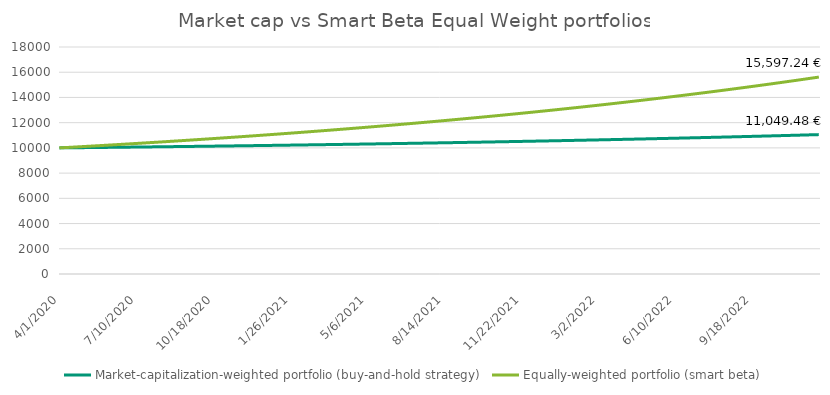
| Category | Equally-weighted portfolio (smart beta) | Market-capitalization-weighted portfolio (buy-and-hold strategy) |
|---|---|---|
| 4/1/20 |  | 10000 |
| 4/2/20 |  | 10000.625 |
| 4/3/20 |  | 10001.251 |
| 4/4/20 |  | 10001.877 |
| 4/5/20 |  | 10002.504 |
| 4/6/20 |  | 10003.131 |
| 4/7/20 |  | 10003.759 |
| 4/8/20 |  | 10004.388 |
| 4/9/20 |  | 10005.018 |
| 4/10/20 |  | 10005.648 |
| 4/11/20 |  | 10006.278 |
| 4/12/20 |  | 10006.909 |
| 4/13/20 |  | 10007.541 |
| 4/14/20 |  | 10008.174 |
| 4/15/20 |  | 10008.807 |
| 4/16/20 |  | 10009.441 |
| 4/17/20 |  | 10010.075 |
| 4/18/20 |  | 10010.71 |
| 4/19/20 |  | 10011.346 |
| 4/20/20 |  | 10011.982 |
| 4/21/20 |  | 10012.619 |
| 4/22/20 |  | 10013.257 |
| 4/23/20 |  | 10013.895 |
| 4/24/20 |  | 10014.534 |
| 4/25/20 |  | 10015.174 |
| 4/26/20 |  | 10015.814 |
| 4/27/20 |  | 10016.455 |
| 4/28/20 |  | 10017.096 |
| 4/29/20 |  | 10017.738 |
| 4/30/20 |  | 10018.381 |
| 5/1/20 |  | 10019.024 |
| 5/2/20 |  | 10019.668 |
| 5/3/20 |  | 10020.313 |
| 5/4/20 |  | 10020.958 |
| 5/5/20 |  | 10021.604 |
| 5/6/20 |  | 10022.251 |
| 5/7/20 |  | 10022.898 |
| 5/8/20 |  | 10023.546 |
| 5/9/20 |  | 10024.195 |
| 5/10/20 |  | 10024.844 |
| 5/11/20 |  | 10025.494 |
| 5/12/20 |  | 10026.144 |
| 5/13/20 |  | 10026.795 |
| 5/14/20 |  | 10027.447 |
| 5/15/20 |  | 10028.1 |
| 5/16/20 |  | 10028.753 |
| 5/17/20 |  | 10029.406 |
| 5/18/20 |  | 10030.061 |
| 5/19/20 |  | 10030.716 |
| 5/20/20 |  | 10031.372 |
| 5/21/20 |  | 10032.028 |
| 5/22/20 |  | 10032.685 |
| 5/23/20 |  | 10033.343 |
| 5/24/20 |  | 10034.001 |
| 5/25/20 |  | 10034.66 |
| 5/26/20 |  | 10035.32 |
| 5/27/20 |  | 10035.98 |
| 5/28/20 |  | 10036.641 |
| 5/29/20 |  | 10037.303 |
| 5/30/20 |  | 10037.965 |
| 5/31/20 |  | 10038.628 |
| 6/1/20 |  | 10039.292 |
| 6/2/20 |  | 10039.956 |
| 6/3/20 |  | 10040.621 |
| 6/4/20 |  | 10041.286 |
| 6/5/20 |  | 10041.953 |
| 6/6/20 |  | 10042.62 |
| 6/7/20 |  | 10043.287 |
| 6/8/20 |  | 10043.956 |
| 6/9/20 |  | 10044.625 |
| 6/10/20 |  | 10045.294 |
| 6/11/20 |  | 10045.964 |
| 6/12/20 |  | 10046.635 |
| 6/13/20 |  | 10047.307 |
| 6/14/20 |  | 10047.979 |
| 6/15/20 |  | 10048.652 |
| 6/16/20 |  | 10049.326 |
| 6/17/20 |  | 10050 |
| 6/18/20 |  | 10050.675 |
| 6/19/20 |  | 10051.351 |
| 6/20/20 |  | 10052.027 |
| 6/21/20 |  | 10052.704 |
| 6/22/20 |  | 10053.382 |
| 6/23/20 |  | 10054.06 |
| 6/24/20 |  | 10054.74 |
| 6/25/20 |  | 10055.419 |
| 6/26/20 |  | 10056.1 |
| 6/27/20 |  | 10056.781 |
| 6/28/20 |  | 10057.463 |
| 6/29/20 |  | 10058.145 |
| 6/30/20 |  | 10058.828 |
| 7/1/20 |  | 10059.512 |
| 7/2/20 |  | 10060.197 |
| 7/3/20 |  | 10060.882 |
| 7/4/20 |  | 10061.568 |
| 7/5/20 |  | 10062.254 |
| 7/6/20 |  | 10062.941 |
| 7/7/20 |  | 10063.629 |
| 7/8/20 |  | 10064.318 |
| 7/9/20 |  | 10065.007 |
| 7/10/20 |  | 10065.697 |
| 7/11/20 |  | 10066.388 |
| 7/12/20 |  | 10067.079 |
| 7/13/20 |  | 10067.771 |
| 7/14/20 |  | 10068.464 |
| 7/15/20 |  | 10069.158 |
| 7/16/20 |  | 10069.852 |
| 7/17/20 |  | 10070.547 |
| 7/18/20 |  | 10071.242 |
| 7/19/20 |  | 10071.939 |
| 7/20/20 |  | 10072.635 |
| 7/21/20 |  | 10073.333 |
| 7/22/20 |  | 10074.031 |
| 7/23/20 |  | 10074.73 |
| 7/24/20 |  | 10075.43 |
| 7/25/20 |  | 10076.131 |
| 7/26/20 |  | 10076.832 |
| 7/27/20 |  | 10077.534 |
| 7/28/20 |  | 10078.236 |
| 7/29/20 |  | 10078.939 |
| 7/30/20 |  | 10079.643 |
| 7/31/20 |  | 10080.348 |
| 8/1/20 |  | 10081.053 |
| 8/2/20 |  | 10081.759 |
| 8/3/20 |  | 10082.466 |
| 8/4/20 |  | 10083.174 |
| 8/5/20 |  | 10083.882 |
| 8/6/20 |  | 10084.591 |
| 8/7/20 |  | 10085.3 |
| 8/8/20 |  | 10086.01 |
| 8/9/20 |  | 10086.722 |
| 8/10/20 |  | 10087.433 |
| 8/11/20 |  | 10088.146 |
| 8/12/20 |  | 10088.859 |
| 8/13/20 |  | 10089.573 |
| 8/14/20 |  | 10090.287 |
| 8/15/20 |  | 10091.003 |
| 8/16/20 |  | 10091.719 |
| 8/17/20 |  | 10092.435 |
| 8/18/20 |  | 10093.153 |
| 8/19/20 |  | 10093.871 |
| 8/20/20 |  | 10094.59 |
| 8/21/20 |  | 10095.309 |
| 8/22/20 |  | 10096.03 |
| 8/23/20 |  | 10096.751 |
| 8/24/20 |  | 10097.472 |
| 8/25/20 |  | 10098.195 |
| 8/26/20 |  | 10098.918 |
| 8/27/20 |  | 10099.642 |
| 8/28/20 |  | 10100.367 |
| 8/29/20 |  | 10101.092 |
| 8/30/20 |  | 10101.818 |
| 8/31/20 |  | 10102.545 |
| 9/1/20 |  | 10103.272 |
| 9/2/20 |  | 10104.001 |
| 9/3/20 |  | 10104.73 |
| 9/4/20 |  | 10105.459 |
| 9/5/20 |  | 10106.19 |
| 9/6/20 |  | 10106.921 |
| 9/7/20 |  | 10107.653 |
| 9/8/20 |  | 10108.386 |
| 9/9/20 |  | 10109.119 |
| 9/10/20 |  | 10109.853 |
| 9/11/20 |  | 10110.588 |
| 9/12/20 |  | 10111.324 |
| 9/13/20 |  | 10112.06 |
| 9/14/20 |  | 10112.797 |
| 9/15/20 |  | 10113.535 |
| 9/16/20 |  | 10114.273 |
| 9/17/20 |  | 10115.013 |
| 9/18/20 |  | 10115.753 |
| 9/19/20 |  | 10116.493 |
| 9/20/20 |  | 10117.235 |
| 9/21/20 |  | 10117.977 |
| 9/22/20 |  | 10118.72 |
| 9/23/20 |  | 10119.464 |
| 9/24/20 |  | 10120.208 |
| 9/25/20 |  | 10120.953 |
| 9/26/20 |  | 10121.699 |
| 9/27/20 |  | 10122.446 |
| 9/28/20 |  | 10123.194 |
| 9/29/20 |  | 10123.942 |
| 9/30/20 |  | 10124.691 |
| 10/1/20 |  | 10125.44 |
| 10/2/20 |  | 10126.191 |
| 10/3/20 |  | 10126.942 |
| 10/4/20 |  | 10127.694 |
| 10/5/20 |  | 10128.447 |
| 10/6/20 |  | 10129.2 |
| 10/7/20 |  | 10129.954 |
| 10/8/20 |  | 10130.709 |
| 10/9/20 |  | 10131.465 |
| 10/10/20 |  | 10132.221 |
| 10/11/20 |  | 10132.979 |
| 10/12/20 |  | 10133.737 |
| 10/13/20 |  | 10134.495 |
| 10/14/20 |  | 10135.255 |
| 10/15/20 |  | 10136.015 |
| 10/16/20 |  | 10136.776 |
| 10/17/20 |  | 10137.538 |
| 10/18/20 |  | 10138.3 |
| 10/19/20 |  | 10139.064 |
| 10/20/20 |  | 10139.828 |
| 10/21/20 |  | 10140.593 |
| 10/22/20 |  | 10141.358 |
| 10/23/20 |  | 10142.125 |
| 10/24/20 |  | 10142.892 |
| 10/25/20 |  | 10143.66 |
| 10/26/20 |  | 10144.428 |
| 10/27/20 |  | 10145.198 |
| 10/28/20 |  | 10145.968 |
| 10/29/20 |  | 10146.739 |
| 10/30/20 |  | 10147.511 |
| 10/31/20 |  | 10148.283 |
| 11/1/20 |  | 10149.056 |
| 11/2/20 |  | 10149.83 |
| 11/3/20 |  | 10150.605 |
| 11/4/20 |  | 10151.381 |
| 11/5/20 |  | 10152.157 |
| 11/6/20 |  | 10152.934 |
| 11/7/20 |  | 10153.712 |
| 11/8/20 |  | 10154.491 |
| 11/9/20 |  | 10155.271 |
| 11/10/20 |  | 10156.051 |
| 11/11/20 |  | 10156.832 |
| 11/12/20 |  | 10157.614 |
| 11/13/20 |  | 10158.396 |
| 11/14/20 |  | 10159.18 |
| 11/15/20 |  | 10159.964 |
| 11/16/20 |  | 10160.749 |
| 11/17/20 |  | 10161.535 |
| 11/18/20 |  | 10162.321 |
| 11/19/20 |  | 10163.108 |
| 11/20/20 |  | 10163.897 |
| 11/21/20 |  | 10164.685 |
| 11/22/20 |  | 10165.475 |
| 11/23/20 |  | 10166.266 |
| 11/24/20 |  | 10167.057 |
| 11/25/20 |  | 10167.849 |
| 11/26/20 |  | 10168.642 |
| 11/27/20 |  | 10169.435 |
| 11/28/20 |  | 10170.23 |
| 11/29/20 |  | 10171.025 |
| 11/30/20 |  | 10171.821 |
| 12/1/20 |  | 10172.618 |
| 12/2/20 |  | 10173.416 |
| 12/3/20 |  | 10174.214 |
| 12/4/20 |  | 10175.013 |
| 12/5/20 |  | 10175.813 |
| 12/6/20 |  | 10176.614 |
| 12/7/20 |  | 10177.416 |
| 12/8/20 |  | 10178.218 |
| 12/9/20 |  | 10179.021 |
| 12/10/20 |  | 10179.825 |
| 12/11/20 |  | 10180.63 |
| 12/12/20 |  | 10181.436 |
| 12/13/20 |  | 10182.242 |
| 12/14/20 |  | 10183.049 |
| 12/15/20 |  | 10183.857 |
| 12/16/20 |  | 10184.666 |
| 12/17/20 |  | 10185.476 |
| 12/18/20 |  | 10186.286 |
| 12/19/20 |  | 10187.098 |
| 12/20/20 |  | 10187.91 |
| 12/21/20 |  | 10188.723 |
| 12/22/20 |  | 10189.536 |
| 12/23/20 |  | 10190.351 |
| 12/24/20 |  | 10191.166 |
| 12/25/20 |  | 10191.983 |
| 12/26/20 |  | 10192.8 |
| 12/27/20 |  | 10193.617 |
| 12/28/20 |  | 10194.436 |
| 12/29/20 |  | 10195.255 |
| 12/30/20 |  | 10196.076 |
| 12/31/20 |  | 10196.897 |
| 1/1/21 |  | 10197.719 |
| 1/2/21 |  | 10198.541 |
| 1/3/21 |  | 10199.365 |
| 1/4/21 |  | 10200.189 |
| 1/5/21 |  | 10201.014 |
| 1/6/21 |  | 10201.84 |
| 1/7/21 |  | 10202.667 |
| 1/8/21 |  | 10203.495 |
| 1/9/21 |  | 10204.323 |
| 1/10/21 |  | 10205.153 |
| 1/11/21 |  | 10205.983 |
| 1/12/21 |  | 10206.814 |
| 1/13/21 |  | 10207.646 |
| 1/14/21 |  | 10208.478 |
| 1/15/21 |  | 10209.312 |
| 1/16/21 |  | 10210.146 |
| 1/17/21 |  | 10210.981 |
| 1/18/21 |  | 10211.817 |
| 1/19/21 |  | 10212.654 |
| 1/20/21 |  | 10213.492 |
| 1/21/21 |  | 10214.33 |
| 1/22/21 |  | 10215.17 |
| 1/23/21 |  | 10216.01 |
| 1/24/21 |  | 10216.851 |
| 1/25/21 |  | 10217.693 |
| 1/26/21 |  | 10218.535 |
| 1/27/21 |  | 10219.379 |
| 1/28/21 |  | 10220.223 |
| 1/29/21 |  | 10221.068 |
| 1/30/21 |  | 10221.915 |
| 1/31/21 |  | 10222.761 |
| 2/1/21 |  | 10223.609 |
| 2/2/21 |  | 10224.458 |
| 2/3/21 |  | 10225.307 |
| 2/4/21 |  | 10226.158 |
| 2/5/21 |  | 10227.009 |
| 2/6/21 |  | 10227.861 |
| 2/7/21 |  | 10228.714 |
| 2/8/21 |  | 10229.567 |
| 2/9/21 |  | 10230.422 |
| 2/10/21 |  | 10231.277 |
| 2/11/21 |  | 10232.134 |
| 2/12/21 |  | 10232.991 |
| 2/13/21 |  | 10233.849 |
| 2/14/21 |  | 10234.708 |
| 2/15/21 |  | 10235.567 |
| 2/16/21 |  | 10236.428 |
| 2/17/21 |  | 10237.289 |
| 2/18/21 |  | 10238.152 |
| 2/19/21 |  | 10239.015 |
| 2/20/21 |  | 10239.879 |
| 2/21/21 |  | 10240.744 |
| 2/22/21 |  | 10241.609 |
| 2/23/21 |  | 10242.476 |
| 2/24/21 |  | 10243.343 |
| 2/25/21 |  | 10244.212 |
| 2/26/21 |  | 10245.081 |
| 2/27/21 |  | 10245.951 |
| 2/28/21 |  | 10246.822 |
| 3/1/21 |  | 10247.694 |
| 3/2/21 |  | 10248.567 |
| 3/3/21 |  | 10249.44 |
| 3/4/21 |  | 10250.315 |
| 3/5/21 |  | 10251.19 |
| 3/6/21 |  | 10252.066 |
| 3/7/21 |  | 10252.943 |
| 3/8/21 |  | 10253.821 |
| 3/9/21 |  | 10254.7 |
| 3/10/21 |  | 10255.58 |
| 3/11/21 |  | 10256.46 |
| 3/12/21 |  | 10257.342 |
| 3/13/21 |  | 10258.224 |
| 3/14/21 |  | 10259.107 |
| 3/15/21 |  | 10259.991 |
| 3/16/21 |  | 10260.876 |
| 3/17/21 |  | 10261.762 |
| 3/18/21 |  | 10262.649 |
| 3/19/21 |  | 10263.537 |
| 3/20/21 |  | 10264.425 |
| 3/21/21 |  | 10265.314 |
| 3/22/21 |  | 10266.205 |
| 3/23/21 |  | 10267.096 |
| 3/24/21 |  | 10267.988 |
| 3/25/21 |  | 10268.881 |
| 3/26/21 |  | 10269.775 |
| 3/27/21 |  | 10270.67 |
| 3/28/21 |  | 10271.565 |
| 3/29/21 |  | 10272.462 |
| 3/30/21 |  | 10273.359 |
| 3/31/21 |  | 10274.258 |
| 4/1/21 |  | 10275.157 |
| 4/2/21 |  | 10276.057 |
| 4/3/21 |  | 10276.958 |
| 4/4/21 |  | 10277.86 |
| 4/5/21 |  | 10278.763 |
| 4/6/21 |  | 10279.667 |
| 4/7/21 |  | 10280.572 |
| 4/8/21 |  | 10281.477 |
| 4/9/21 |  | 10282.384 |
| 4/10/21 |  | 10283.291 |
| 4/11/21 |  | 10284.199 |
| 4/12/21 |  | 10285.108 |
| 4/13/21 |  | 10286.019 |
| 4/14/21 |  | 10286.93 |
| 4/15/21 |  | 10287.842 |
| 4/16/21 |  | 10288.754 |
| 4/17/21 |  | 10289.668 |
| 4/18/21 |  | 10290.583 |
| 4/19/21 |  | 10291.498 |
| 4/20/21 |  | 10292.415 |
| 4/21/21 |  | 10293.332 |
| 4/22/21 |  | 10294.251 |
| 4/23/21 |  | 10295.17 |
| 4/24/21 |  | 10296.09 |
| 4/25/21 |  | 10297.011 |
| 4/26/21 |  | 10297.933 |
| 4/27/21 |  | 10298.856 |
| 4/28/21 |  | 10299.78 |
| 4/29/21 |  | 10300.705 |
| 4/30/21 |  | 10301.63 |
| 5/1/21 |  | 10302.557 |
| 5/2/21 |  | 10303.485 |
| 5/3/21 |  | 10304.413 |
| 5/4/21 |  | 10305.342 |
| 5/5/21 |  | 10306.273 |
| 5/6/21 |  | 10307.204 |
| 5/7/21 |  | 10308.136 |
| 5/8/21 |  | 10309.069 |
| 5/9/21 |  | 10310.004 |
| 5/10/21 |  | 10310.939 |
| 5/11/21 |  | 10311.874 |
| 5/12/21 |  | 10312.811 |
| 5/13/21 |  | 10313.749 |
| 5/14/21 |  | 10314.688 |
| 5/15/21 |  | 10315.628 |
| 5/16/21 |  | 10316.568 |
| 5/17/21 |  | 10317.51 |
| 5/18/21 |  | 10318.452 |
| 5/19/21 |  | 10319.396 |
| 5/20/21 |  | 10320.34 |
| 5/21/21 |  | 10321.285 |
| 5/22/21 |  | 10322.232 |
| 5/23/21 |  | 10323.179 |
| 5/24/21 |  | 10324.127 |
| 5/25/21 |  | 10325.076 |
| 5/26/21 |  | 10326.026 |
| 5/27/21 |  | 10326.977 |
| 5/28/21 |  | 10327.929 |
| 5/29/21 |  | 10328.882 |
| 5/30/21 |  | 10329.836 |
| 5/31/21 |  | 10330.791 |
| 6/1/21 |  | 10331.747 |
| 6/2/21 |  | 10332.704 |
| 6/3/21 |  | 10333.661 |
| 6/4/21 |  | 10334.62 |
| 6/5/21 |  | 10335.58 |
| 6/6/21 |  | 10336.54 |
| 6/7/21 |  | 10337.502 |
| 6/8/21 |  | 10338.464 |
| 6/9/21 |  | 10339.428 |
| 6/10/21 |  | 10340.392 |
| 6/11/21 |  | 10341.357 |
| 6/12/21 |  | 10342.324 |
| 6/13/21 |  | 10343.291 |
| 6/14/21 |  | 10344.259 |
| 6/15/21 |  | 10345.229 |
| 6/16/21 |  | 10346.199 |
| 6/17/21 |  | 10347.17 |
| 6/18/21 |  | 10348.142 |
| 6/19/21 |  | 10349.115 |
| 6/20/21 |  | 10350.09 |
| 6/21/21 |  | 10351.065 |
| 6/22/21 |  | 10352.041 |
| 6/23/21 |  | 10353.018 |
| 6/24/21 |  | 10353.996 |
| 6/25/21 |  | 10354.975 |
| 6/26/21 |  | 10355.955 |
| 6/27/21 |  | 10356.936 |
| 6/28/21 |  | 10357.918 |
| 6/29/21 |  | 10358.901 |
| 6/30/21 |  | 10359.884 |
| 7/1/21 |  | 10360.869 |
| 7/2/21 |  | 10361.855 |
| 7/3/21 |  | 10362.842 |
| 7/4/21 |  | 10363.83 |
| 7/5/21 |  | 10364.819 |
| 7/6/21 |  | 10365.809 |
| 7/7/21 |  | 10366.799 |
| 7/8/21 |  | 10367.791 |
| 7/9/21 |  | 10368.784 |
| 7/10/21 |  | 10369.778 |
| 7/11/21 |  | 10370.772 |
| 7/12/21 |  | 10371.768 |
| 7/13/21 |  | 10372.765 |
| 7/14/21 |  | 10373.763 |
| 7/15/21 |  | 10374.762 |
| 7/16/21 |  | 10375.761 |
| 7/17/21 |  | 10376.762 |
| 7/18/21 |  | 10377.764 |
| 7/19/21 |  | 10378.767 |
| 7/20/21 |  | 10379.77 |
| 7/21/21 |  | 10380.775 |
| 7/22/21 |  | 10381.781 |
| 7/23/21 |  | 10382.788 |
| 7/24/21 |  | 10383.795 |
| 7/25/21 |  | 10384.804 |
| 7/26/21 |  | 10385.814 |
| 7/27/21 |  | 10386.825 |
| 7/28/21 |  | 10387.837 |
| 7/29/21 |  | 10388.85 |
| 7/30/21 |  | 10389.863 |
| 7/31/21 |  | 10390.878 |
| 8/1/21 |  | 10391.894 |
| 8/2/21 |  | 10392.911 |
| 8/3/21 |  | 10393.929 |
| 8/4/21 |  | 10394.948 |
| 8/5/21 |  | 10395.968 |
| 8/6/21 |  | 10396.989 |
| 8/7/21 |  | 10398.011 |
| 8/8/21 |  | 10399.034 |
| 8/9/21 |  | 10400.058 |
| 8/10/21 |  | 10401.083 |
| 8/11/21 |  | 10402.109 |
| 8/12/21 |  | 10403.136 |
| 8/13/21 |  | 10404.164 |
| 8/14/21 |  | 10405.193 |
| 8/15/21 |  | 10406.224 |
| 8/16/21 |  | 10407.255 |
| 8/17/21 |  | 10408.287 |
| 8/18/21 |  | 10409.32 |
| 8/19/21 |  | 10410.355 |
| 8/20/21 |  | 10411.39 |
| 8/21/21 |  | 10412.426 |
| 8/22/21 |  | 10413.464 |
| 8/23/21 |  | 10414.502 |
| 8/24/21 |  | 10415.542 |
| 8/25/21 |  | 10416.582 |
| 8/26/21 |  | 10417.624 |
| 8/27/21 |  | 10418.667 |
| 8/28/21 |  | 10419.71 |
| 8/29/21 |  | 10420.755 |
| 8/30/21 |  | 10421.801 |
| 8/31/21 |  | 10422.847 |
| 9/1/21 |  | 10423.895 |
| 9/2/21 |  | 10424.944 |
| 9/3/21 |  | 10425.994 |
| 9/4/21 |  | 10427.045 |
| 9/5/21 |  | 10428.097 |
| 9/6/21 |  | 10429.15 |
| 9/7/21 |  | 10430.204 |
| 9/8/21 |  | 10431.26 |
| 9/9/21 |  | 10432.316 |
| 9/10/21 |  | 10433.373 |
| 9/11/21 |  | 10434.432 |
| 9/12/21 |  | 10435.491 |
| 9/13/21 |  | 10436.552 |
| 9/14/21 |  | 10437.613 |
| 9/15/21 |  | 10438.676 |
| 9/16/21 |  | 10439.739 |
| 9/17/21 |  | 10440.804 |
| 9/18/21 |  | 10441.87 |
| 9/19/21 |  | 10442.937 |
| 9/20/21 |  | 10444.005 |
| 9/21/21 |  | 10445.074 |
| 9/22/21 |  | 10446.144 |
| 9/23/21 |  | 10447.215 |
| 9/24/21 |  | 10448.287 |
| 9/25/21 |  | 10449.36 |
| 9/26/21 |  | 10450.435 |
| 9/27/21 |  | 10451.51 |
| 9/28/21 |  | 10452.587 |
| 9/29/21 |  | 10453.664 |
| 9/30/21 |  | 10454.743 |
| 10/1/21 |  | 10455.823 |
| 10/2/21 |  | 10456.904 |
| 10/3/21 |  | 10457.985 |
| 10/4/21 |  | 10459.068 |
| 10/5/21 |  | 10460.153 |
| 10/6/21 |  | 10461.238 |
| 10/7/21 |  | 10462.324 |
| 10/8/21 |  | 10463.411 |
| 10/9/21 |  | 10464.5 |
| 10/10/21 |  | 10465.589 |
| 10/11/21 |  | 10466.68 |
| 10/12/21 |  | 10467.771 |
| 10/13/21 |  | 10468.864 |
| 10/14/21 |  | 10469.958 |
| 10/15/21 |  | 10471.053 |
| 10/16/21 |  | 10472.149 |
| 10/17/21 |  | 10473.246 |
| 10/18/21 |  | 10474.344 |
| 10/19/21 |  | 10475.444 |
| 10/20/21 |  | 10476.544 |
| 10/21/21 |  | 10477.646 |
| 10/22/21 |  | 10478.748 |
| 10/23/21 |  | 10479.852 |
| 10/24/21 |  | 10480.957 |
| 10/25/21 |  | 10482.063 |
| 10/26/21 |  | 10483.17 |
| 10/27/21 |  | 10484.278 |
| 10/28/21 |  | 10485.388 |
| 10/29/21 |  | 10486.498 |
| 10/30/21 |  | 10487.609 |
| 10/31/21 |  | 10488.722 |
| 11/1/21 |  | 10489.836 |
| 11/2/21 |  | 10490.951 |
| 11/3/21 |  | 10492.067 |
| 11/4/21 |  | 10493.184 |
| 11/5/21 |  | 10494.302 |
| 11/6/21 |  | 10495.421 |
| 11/7/21 |  | 10496.541 |
| 11/8/21 |  | 10497.663 |
| 11/9/21 |  | 10498.786 |
| 11/10/21 |  | 10499.909 |
| 11/11/21 |  | 10501.034 |
| 11/12/21 |  | 10502.16 |
| 11/13/21 |  | 10503.288 |
| 11/14/21 |  | 10504.416 |
| 11/15/21 |  | 10505.545 |
| 11/16/21 |  | 10506.676 |
| 11/17/21 |  | 10507.808 |
| 11/18/21 |  | 10508.94 |
| 11/19/21 |  | 10510.074 |
| 11/20/21 |  | 10511.209 |
| 11/21/21 |  | 10512.346 |
| 11/22/21 |  | 10513.483 |
| 11/23/21 |  | 10514.621 |
| 11/24/21 |  | 10515.761 |
| 11/25/21 |  | 10516.902 |
| 11/26/21 |  | 10518.044 |
| 11/27/21 |  | 10519.187 |
| 11/28/21 |  | 10520.331 |
| 11/29/21 |  | 10521.476 |
| 11/30/21 |  | 10522.623 |
| 12/1/21 |  | 10523.77 |
| 12/2/21 |  | 10524.919 |
| 12/3/21 |  | 10526.069 |
| 12/4/21 |  | 10527.22 |
| 12/5/21 |  | 10528.372 |
| 12/6/21 |  | 10529.526 |
| 12/7/21 |  | 10530.68 |
| 12/8/21 |  | 10531.836 |
| 12/9/21 |  | 10532.993 |
| 12/10/21 |  | 10534.151 |
| 12/11/21 |  | 10535.31 |
| 12/12/21 |  | 10536.47 |
| 12/13/21 |  | 10537.632 |
| 12/14/21 |  | 10538.794 |
| 12/15/21 |  | 10539.958 |
| 12/16/21 |  | 10541.123 |
| 12/17/21 |  | 10542.289 |
| 12/18/21 |  | 10543.456 |
| 12/19/21 |  | 10544.625 |
| 12/20/21 |  | 10545.795 |
| 12/21/21 |  | 10546.965 |
| 12/22/21 |  | 10548.137 |
| 12/23/21 |  | 10549.31 |
| 12/24/21 |  | 10550.485 |
| 12/25/21 |  | 10551.66 |
| 12/26/21 |  | 10552.837 |
| 12/27/21 |  | 10554.015 |
| 12/28/21 |  | 10555.194 |
| 12/29/21 |  | 10556.374 |
| 12/30/21 |  | 10557.555 |
| 12/31/21 |  | 10558.738 |
| 1/1/22 |  | 10559.922 |
| 1/2/22 |  | 10561.106 |
| 1/3/22 |  | 10562.293 |
| 1/4/22 |  | 10563.48 |
| 1/5/22 |  | 10564.668 |
| 1/6/22 |  | 10565.858 |
| 1/7/22 |  | 10567.049 |
| 1/8/22 |  | 10568.241 |
| 1/9/22 |  | 10569.434 |
| 1/10/22 |  | 10570.629 |
| 1/11/22 |  | 10571.824 |
| 1/12/22 |  | 10573.021 |
| 1/13/22 |  | 10574.219 |
| 1/14/22 |  | 10575.418 |
| 1/15/22 |  | 10576.619 |
| 1/16/22 |  | 10577.82 |
| 1/17/22 |  | 10579.023 |
| 1/18/22 |  | 10580.227 |
| 1/19/22 |  | 10581.432 |
| 1/20/22 |  | 10582.639 |
| 1/21/22 |  | 10583.846 |
| 1/22/22 |  | 10585.055 |
| 1/23/22 |  | 10586.265 |
| 1/24/22 |  | 10587.477 |
| 1/25/22 |  | 10588.689 |
| 1/26/22 |  | 10589.903 |
| 1/27/22 |  | 10591.118 |
| 1/28/22 |  | 10592.334 |
| 1/29/22 |  | 10593.551 |
| 1/30/22 |  | 10594.77 |
| 1/31/22 |  | 10595.989 |
| 2/1/22 |  | 10597.21 |
| 2/2/22 |  | 10598.433 |
| 2/3/22 |  | 10599.656 |
| 2/4/22 |  | 10600.881 |
| 2/5/22 |  | 10602.107 |
| 2/6/22 |  | 10603.334 |
| 2/7/22 |  | 10604.562 |
| 2/8/22 |  | 10605.792 |
| 2/9/22 |  | 10607.022 |
| 2/10/22 |  | 10608.254 |
| 2/11/22 |  | 10609.488 |
| 2/12/22 |  | 10610.722 |
| 2/13/22 |  | 10611.958 |
| 2/14/22 |  | 10613.195 |
| 2/15/22 |  | 10614.433 |
| 2/16/22 |  | 10615.673 |
| 2/17/22 |  | 10616.913 |
| 2/18/22 |  | 10618.155 |
| 2/19/22 |  | 10619.398 |
| 2/20/22 |  | 10620.643 |
| 2/21/22 |  | 10621.888 |
| 2/22/22 |  | 10623.135 |
| 2/23/22 |  | 10624.383 |
| 2/24/22 |  | 10625.633 |
| 2/25/22 |  | 10626.883 |
| 2/26/22 |  | 10628.135 |
| 2/27/22 |  | 10629.388 |
| 2/28/22 |  | 10630.643 |
| 3/1/22 |  | 10631.898 |
| 3/2/22 |  | 10633.155 |
| 3/3/22 |  | 10634.413 |
| 3/4/22 |  | 10635.673 |
| 3/5/22 |  | 10636.934 |
| 3/6/22 |  | 10638.195 |
| 3/7/22 |  | 10639.459 |
| 3/8/22 |  | 10640.723 |
| 3/9/22 |  | 10641.989 |
| 3/10/22 |  | 10643.256 |
| 3/11/22 |  | 10644.524 |
| 3/12/22 |  | 10645.794 |
| 3/13/22 |  | 10647.064 |
| 3/14/22 |  | 10648.336 |
| 3/15/22 |  | 10649.61 |
| 3/16/22 |  | 10650.884 |
| 3/17/22 |  | 10652.16 |
| 3/18/22 |  | 10653.437 |
| 3/19/22 |  | 10654.716 |
| 3/20/22 |  | 10655.996 |
| 3/21/22 |  | 10657.277 |
| 3/22/22 |  | 10658.559 |
| 3/23/22 |  | 10659.842 |
| 3/24/22 |  | 10661.127 |
| 3/25/22 |  | 10662.413 |
| 3/26/22 |  | 10663.701 |
| 3/27/22 |  | 10664.99 |
| 3/28/22 |  | 10666.28 |
| 3/29/22 |  | 10667.571 |
| 3/30/22 |  | 10668.863 |
| 3/31/22 |  | 10670.157 |
| 4/1/22 |  | 10671.452 |
| 4/2/22 |  | 10672.749 |
| 4/3/22 |  | 10674.047 |
| 4/4/22 |  | 10675.346 |
| 4/5/22 |  | 10676.646 |
| 4/6/22 |  | 10677.948 |
| 4/7/22 |  | 10679.251 |
| 4/8/22 |  | 10680.555 |
| 4/9/22 |  | 10681.86 |
| 4/10/22 |  | 10683.167 |
| 4/11/22 |  | 10684.475 |
| 4/12/22 |  | 10685.785 |
| 4/13/22 |  | 10687.096 |
| 4/14/22 |  | 10688.408 |
| 4/15/22 |  | 10689.721 |
| 4/16/22 |  | 10691.036 |
| 4/17/22 |  | 10692.352 |
| 4/18/22 |  | 10693.669 |
| 4/19/22 |  | 10694.988 |
| 4/20/22 |  | 10696.308 |
| 4/21/22 |  | 10697.629 |
| 4/22/22 |  | 10698.952 |
| 4/23/22 |  | 10700.276 |
| 4/24/22 |  | 10701.601 |
| 4/25/22 |  | 10702.928 |
| 4/26/22 |  | 10704.256 |
| 4/27/22 |  | 10705.585 |
| 4/28/22 |  | 10706.915 |
| 4/29/22 |  | 10708.247 |
| 4/30/22 |  | 10709.581 |
| 5/1/22 |  | 10710.915 |
| 5/2/22 |  | 10712.251 |
| 5/3/22 |  | 10713.588 |
| 5/4/22 |  | 10714.927 |
| 5/5/22 |  | 10716.267 |
| 5/6/22 |  | 10717.608 |
| 5/7/22 |  | 10718.951 |
| 5/8/22 |  | 10720.295 |
| 5/9/22 |  | 10721.64 |
| 5/10/22 |  | 10722.987 |
| 5/11/22 |  | 10724.335 |
| 5/12/22 |  | 10725.684 |
| 5/13/22 |  | 10727.035 |
| 5/14/22 |  | 10728.387 |
| 5/15/22 |  | 10729.74 |
| 5/16/22 |  | 10731.095 |
| 5/17/22 |  | 10732.451 |
| 5/18/22 |  | 10733.808 |
| 5/19/22 |  | 10735.167 |
| 5/20/22 |  | 10736.527 |
| 5/21/22 |  | 10737.889 |
| 5/22/22 |  | 10739.252 |
| 5/23/22 |  | 10740.616 |
| 5/24/22 |  | 10741.982 |
| 5/25/22 |  | 10743.349 |
| 5/26/22 |  | 10744.717 |
| 5/27/22 |  | 10746.087 |
| 5/28/22 |  | 10747.458 |
| 5/29/22 |  | 10748.83 |
| 5/30/22 |  | 10750.204 |
| 5/31/22 |  | 10751.579 |
| 6/1/22 |  | 10752.956 |
| 6/2/22 |  | 10754.334 |
| 6/3/22 |  | 10755.713 |
| 6/4/22 |  | 10757.094 |
| 6/5/22 |  | 10758.476 |
| 6/6/22 |  | 10759.859 |
| 6/7/22 |  | 10761.244 |
| 6/8/22 |  | 10762.631 |
| 6/9/22 |  | 10764.018 |
| 6/10/22 |  | 10765.407 |
| 6/11/22 |  | 10766.798 |
| 6/12/22 |  | 10768.189 |
| 6/13/22 |  | 10769.583 |
| 6/14/22 |  | 10770.977 |
| 6/15/22 |  | 10772.373 |
| 6/16/22 |  | 10773.771 |
| 6/17/22 |  | 10775.169 |
| 6/18/22 |  | 10776.569 |
| 6/19/22 |  | 10777.971 |
| 6/20/22 |  | 10779.374 |
| 6/21/22 |  | 10780.778 |
| 6/22/22 |  | 10782.184 |
| 6/23/22 |  | 10783.591 |
| 6/24/22 |  | 10785 |
| 6/25/22 |  | 10786.41 |
| 6/26/22 |  | 10787.821 |
| 6/27/22 |  | 10789.234 |
| 6/28/22 |  | 10790.648 |
| 6/29/22 |  | 10792.064 |
| 6/30/22 |  | 10793.481 |
| 7/1/22 |  | 10794.9 |
| 7/2/22 |  | 10796.319 |
| 7/3/22 |  | 10797.741 |
| 7/4/22 |  | 10799.164 |
| 7/5/22 |  | 10800.588 |
| 7/6/22 |  | 10802.013 |
| 7/7/22 |  | 10803.44 |
| 7/8/22 |  | 10804.869 |
| 7/9/22 |  | 10806.299 |
| 7/10/22 |  | 10807.73 |
| 7/11/22 |  | 10809.163 |
| 7/12/22 |  | 10810.597 |
| 7/13/22 |  | 10812.032 |
| 7/14/22 |  | 10813.469 |
| 7/15/22 |  | 10814.908 |
| 7/16/22 |  | 10816.348 |
| 7/17/22 |  | 10817.789 |
| 7/18/22 |  | 10819.232 |
| 7/19/22 |  | 10820.676 |
| 7/20/22 |  | 10822.122 |
| 7/21/22 |  | 10823.569 |
| 7/22/22 |  | 10825.018 |
| 7/23/22 |  | 10826.468 |
| 7/24/22 |  | 10827.919 |
| 7/25/22 |  | 10829.372 |
| 7/26/22 |  | 10830.826 |
| 7/27/22 |  | 10832.282 |
| 7/28/22 |  | 10833.739 |
| 7/29/22 |  | 10835.198 |
| 7/30/22 |  | 10836.658 |
| 7/31/22 |  | 10838.12 |
| 8/1/22 |  | 10839.583 |
| 8/2/22 |  | 10841.048 |
| 8/3/22 |  | 10842.514 |
| 8/4/22 |  | 10843.981 |
| 8/5/22 |  | 10845.45 |
| 8/6/22 |  | 10846.921 |
| 8/7/22 |  | 10848.393 |
| 8/8/22 |  | 10849.866 |
| 8/9/22 |  | 10851.341 |
| 8/10/22 |  | 10852.817 |
| 8/11/22 |  | 10854.295 |
| 8/12/22 |  | 10855.774 |
| 8/13/22 |  | 10857.255 |
| 8/14/22 |  | 10858.737 |
| 8/15/22 |  | 10860.221 |
| 8/16/22 |  | 10861.706 |
| 8/17/22 |  | 10863.193 |
| 8/18/22 |  | 10864.681 |
| 8/19/22 |  | 10866.171 |
| 8/20/22 |  | 10867.662 |
| 8/21/22 |  | 10869.155 |
| 8/22/22 |  | 10870.649 |
| 8/23/22 |  | 10872.145 |
| 8/24/22 |  | 10873.642 |
| 8/25/22 |  | 10875.14 |
| 8/26/22 |  | 10876.64 |
| 8/27/22 |  | 10878.142 |
| 8/28/22 |  | 10879.645 |
| 8/29/22 |  | 10881.15 |
| 8/30/22 |  | 10882.656 |
| 8/31/22 |  | 10884.164 |
| 9/1/22 |  | 10885.673 |
| 9/2/22 |  | 10887.184 |
| 9/3/22 |  | 10888.696 |
| 9/4/22 |  | 10890.209 |
| 9/5/22 |  | 10891.725 |
| 9/6/22 |  | 10893.241 |
| 9/7/22 |  | 10894.76 |
| 9/8/22 |  | 10896.279 |
| 9/9/22 |  | 10897.801 |
| 9/10/22 |  | 10899.323 |
| 9/11/22 |  | 10900.848 |
| 9/12/22 |  | 10902.374 |
| 9/13/22 |  | 10903.901 |
| 9/14/22 |  | 10905.43 |
| 9/15/22 |  | 10906.96 |
| 9/16/22 |  | 10908.492 |
| 9/17/22 |  | 10910.026 |
| 9/18/22 |  | 10911.561 |
| 9/19/22 |  | 10913.097 |
| 9/20/22 |  | 10914.635 |
| 9/21/22 |  | 10916.175 |
| 9/22/22 |  | 10917.716 |
| 9/23/22 |  | 10919.259 |
| 9/24/22 |  | 10920.803 |
| 9/25/22 |  | 10922.349 |
| 9/26/22 |  | 10923.896 |
| 9/27/22 |  | 10925.445 |
| 9/28/22 |  | 10926.996 |
| 9/29/22 |  | 10928.548 |
| 9/30/22 |  | 10930.101 |
| 10/1/22 |  | 10931.656 |
| 10/2/22 |  | 10933.213 |
| 10/3/22 |  | 10934.771 |
| 10/4/22 |  | 10936.331 |
| 10/5/22 |  | 10937.892 |
| 10/6/22 |  | 10939.455 |
| 10/7/22 |  | 10941.02 |
| 10/8/22 |  | 10942.586 |
| 10/9/22 |  | 10944.153 |
| 10/10/22 |  | 10945.722 |
| 10/11/22 |  | 10947.293 |
| 10/12/22 |  | 10948.865 |
| 10/13/22 |  | 10950.439 |
| 10/14/22 |  | 10952.015 |
| 10/15/22 |  | 10953.592 |
| 10/16/22 |  | 10955.17 |
| 10/17/22 |  | 10956.751 |
| 10/18/22 |  | 10958.332 |
| 10/19/22 |  | 10959.916 |
| 10/20/22 |  | 10961.501 |
| 10/21/22 |  | 10963.087 |
| 10/22/22 |  | 10964.675 |
| 10/23/22 |  | 10966.265 |
| 10/24/22 |  | 10967.856 |
| 10/25/22 |  | 10969.449 |
| 10/26/22 |  | 10971.043 |
| 10/27/22 |  | 10972.639 |
| 10/28/22 |  | 10974.237 |
| 10/29/22 |  | 10975.836 |
| 10/30/22 |  | 10977.437 |
| 10/31/22 |  | 10979.04 |
| 11/1/22 |  | 10980.644 |
| 11/2/22 |  | 10982.249 |
| 11/3/22 |  | 10983.857 |
| 11/4/22 |  | 10985.465 |
| 11/5/22 |  | 10987.076 |
| 11/6/22 |  | 10988.688 |
| 11/7/22 |  | 10990.302 |
| 11/8/22 |  | 10991.917 |
| 11/9/22 |  | 10993.534 |
| 11/10/22 |  | 10995.152 |
| 11/11/22 |  | 10996.773 |
| 11/12/22 |  | 10998.394 |
| 11/13/22 |  | 11000.018 |
| 11/14/22 |  | 11001.643 |
| 11/15/22 |  | 11003.269 |
| 11/16/22 |  | 11004.898 |
| 11/17/22 |  | 11006.527 |
| 11/18/22 |  | 11008.159 |
| 11/19/22 |  | 11009.792 |
| 11/20/22 |  | 11011.427 |
| 11/21/22 |  | 11013.063 |
| 11/22/22 |  | 11014.701 |
| 11/23/22 |  | 11016.341 |
| 11/24/22 |  | 11017.983 |
| 11/25/22 |  | 11019.625 |
| 11/26/22 |  | 11021.27 |
| 11/27/22 |  | 11022.916 |
| 11/28/22 |  | 11024.564 |
| 11/29/22 |  | 11026.214 |
| 11/30/22 |  | 11027.865 |
| 12/1/22 |  | 11029.518 |
| 12/2/22 |  | 11031.172 |
| 12/3/22 |  | 11032.829 |
| 12/4/22 |  | 11034.486 |
| 12/5/22 |  | 11036.146 |
| 12/6/22 |  | 11037.807 |
| 12/7/22 |  | 11039.47 |
| 12/8/22 |  | 11041.134 |
| 12/9/22 |  | 11042.801 |
| 12/10/22 |  | 11044.468 |
| 12/11/22 |  | 11046.138 |
| 12/12/22 |  | 11047.809 |
| 12/13/22 |  | 11049.482 |
| 12/14/22 |  | 11051.156 |
| 12/15/22 |  | 11052.832 |
| 12/16/22 |  | 11054.51 |